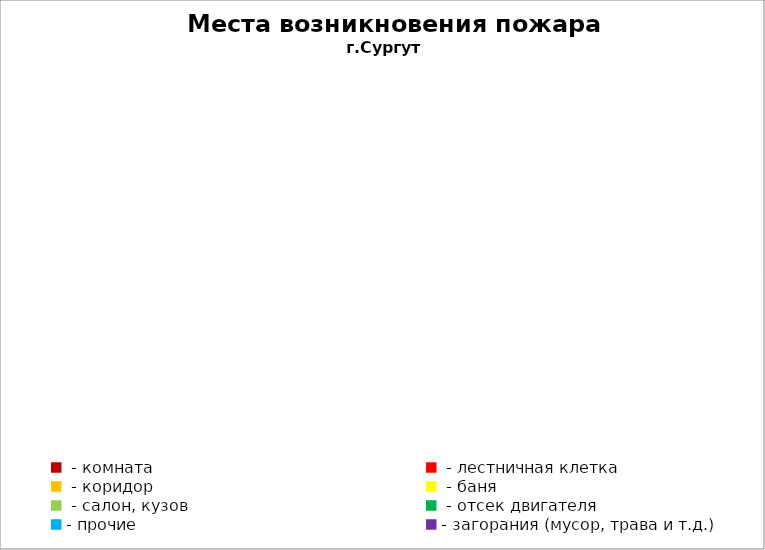
| Category | Места возникновения пожара |
|---|---|
|  - комната | 53 |
|  - лестничная клетка | 4 |
|  - коридор | 26 |
|  - баня | 40 |
|  - салон, кузов | 22 |
|  - отсек двигателя | 28 |
| - прочие | 96 |
| - загорания (мусор, трава и т.д.)  | 165 |